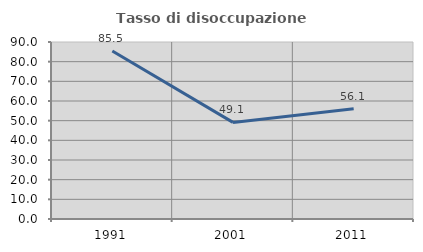
| Category | Tasso di disoccupazione giovanile  |
|---|---|
| 1991.0 | 85.465 |
| 2001.0 | 49.123 |
| 2011.0 | 56.098 |